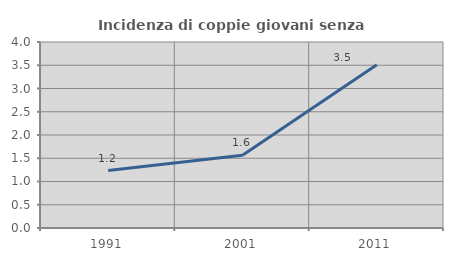
| Category | Incidenza di coppie giovani senza figli |
|---|---|
| 1991.0 | 1.235 |
| 2001.0 | 1.562 |
| 2011.0 | 3.509 |